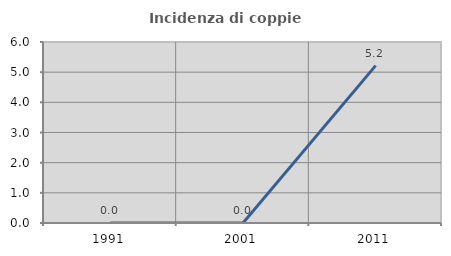
| Category | Incidenza di coppie miste |
|---|---|
| 1991.0 | 0 |
| 2001.0 | 0 |
| 2011.0 | 5.217 |